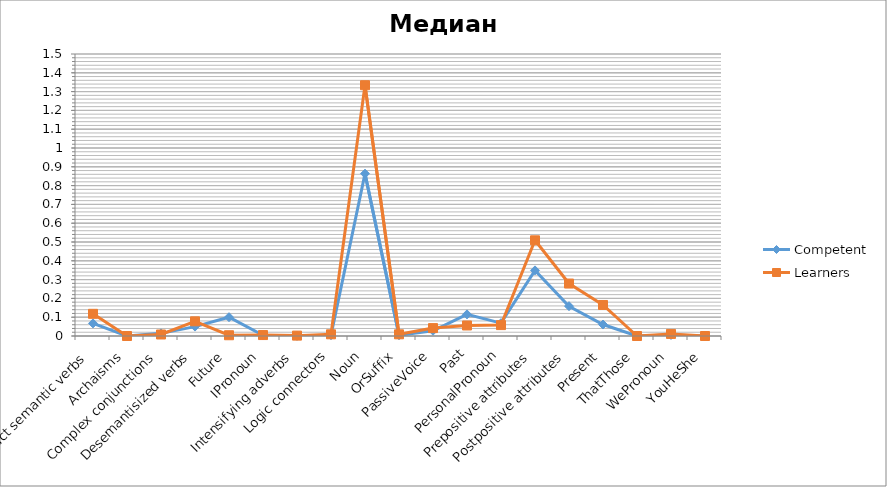
| Category | Competent | Learners |
|---|---|---|
| Abstract semantic verbs | 0.067 | 0.118 |
| Archaisms | 0 | 0 |
| Complex conjunctions | 0.014 | 0.008 |
| Desemantisized verbs | 0.05 | 0.078 |
| Future | 0.1 | 0.004 |
| IPronoun | 0.004 | 0.005 |
| Intensifying adverbs | 0.001 | 0.002 |
| Logic connectors | 0.004 | 0.009 |
| Noun | 0.864 | 1.334 |
| OrSuffix | 0.004 | 0.009 |
| PassiveVoice | 0.028 | 0.042 |
| Past | 0.115 | 0.056 |
| PersonalPronoun | 0.068 | 0.058 |
| Prepositive attributes | 0.349 | 0.509 |
| Postpositive attributes | 0.158 | 0.279 |
| Present | 0.061 | 0.165 |
| ThatThose | 0 | 0 |
| WePronoun | 0.006 | 0.011 |
| YouHeShe | 0 | 0 |